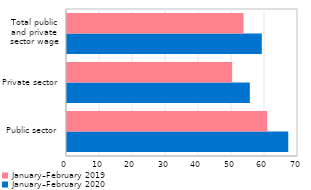
| Category | January–February 2020 | January–February 2019 |
|---|---|---|
| Public sector | 67.05 | 60.67 |
| Private sector | 55.401 | 50.051 |
| Total public
and private
sector wage | 59.036 | 53.474 |